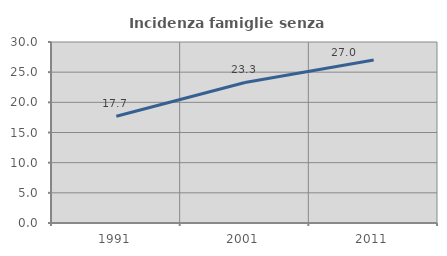
| Category | Incidenza famiglie senza nuclei |
|---|---|
| 1991.0 | 17.685 |
| 2001.0 | 23.297 |
| 2011.0 | 27.03 |